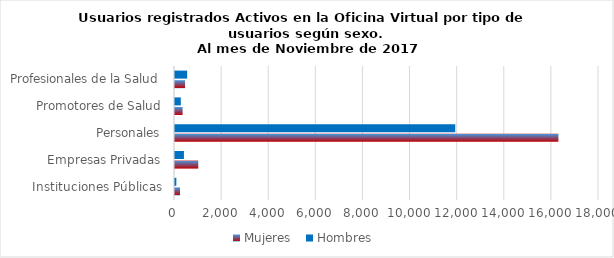
| Category | Mujeres | Hombres |
|---|---|---|
| Instituciones Públicas | 213 | 57 |
| Empresas Privadas | 988 | 379 |
| Personales | 16277 | 11898 |
| Promotores de Salud | 322 | 246 |
| Profesionales de la Salud | 426 | 516 |